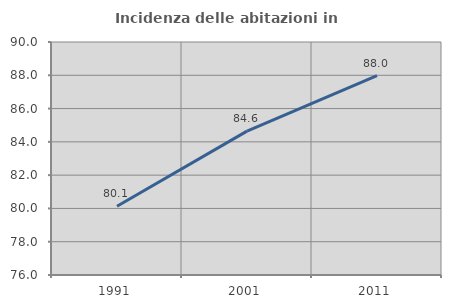
| Category | Incidenza delle abitazioni in proprietà  |
|---|---|
| 1991.0 | 80.132 |
| 2001.0 | 84.647 |
| 2011.0 | 87.979 |